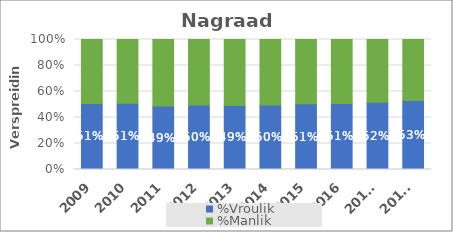
| Category | %Vroulik | %Manlik |
|---|---|---|
| 2009 | 0.508 | 0.492 |
| 2010 | 0.51 | 0.49 |
| 2011 | 0.489 | 0.511 |
| 2012 | 0.496 | 0.504 |
| 2013 | 0.492 | 0.508 |
| 2014 | 0.496 | 0.504 |
| 2015 | 0.506 | 0.494 |
| 2016 | 0.508 | 0.492 |
| 2017* | 0.517 | 0.483 |
| 2018* | 0.532 | 0.468 |